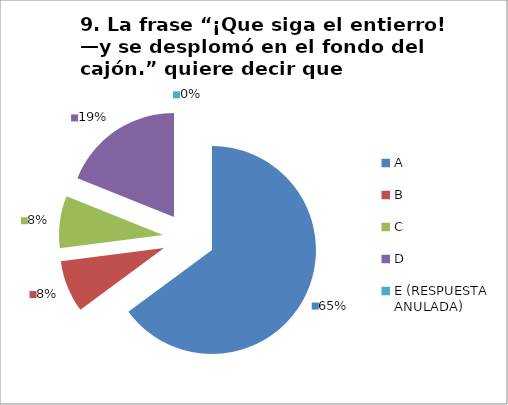
| Category | CANTIDAD DE RESPUESTAS PREGUNTA (9) | PORCENTAJE |
|---|---|---|
| A | 24 | 0.649 |
| B | 3 | 0.081 |
| C | 3 | 0.081 |
| D | 7 | 0.189 |
| E (RESPUESTA ANULADA) | 0 | 0 |